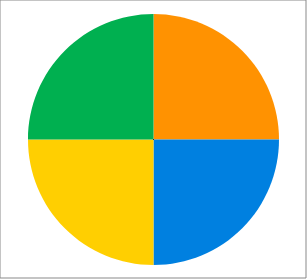
| Category | Series 0 |
|---|---|
| 0 | 7.5 |
| 1 | 7.5 |
| 2 | 7.5 |
| 3 | 7.5 |